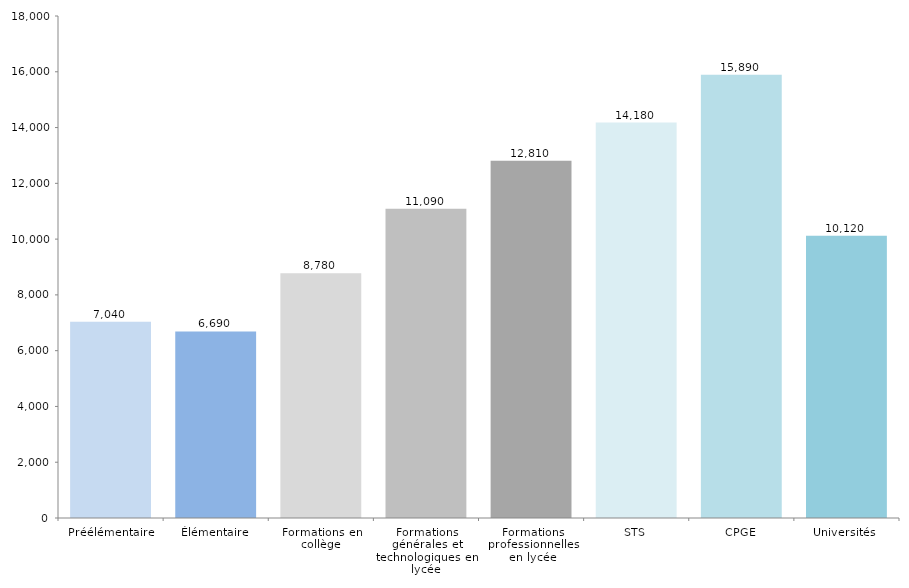
| Category | Series 0 |
|---|---|
| Préélémentaire | 7040 |
| Élémentaire | 6690 |
| Formations en collège | 8780 |
| Formations générales et technologiques en lycée | 11090 |
| Formations professionnelles en lycée | 12810 |
| STS | 14180 |
| CPGE | 15890 |
| Universités  | 10120 |